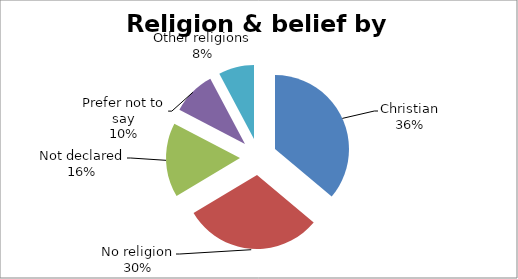
| Category | Series 0 |
|---|---|
| Christian | 707 |
| No religion | 593 |
| Not declared | 318 |
| Prefer not to say | 188 |
| Other religions | 152 |